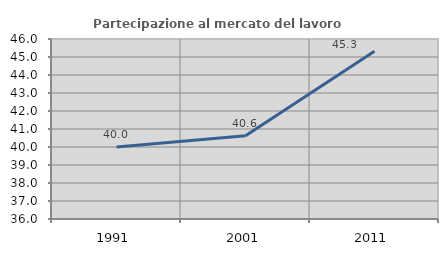
| Category | Partecipazione al mercato del lavoro  femminile |
|---|---|
| 1991.0 | 40 |
| 2001.0 | 40.625 |
| 2011.0 | 45.324 |